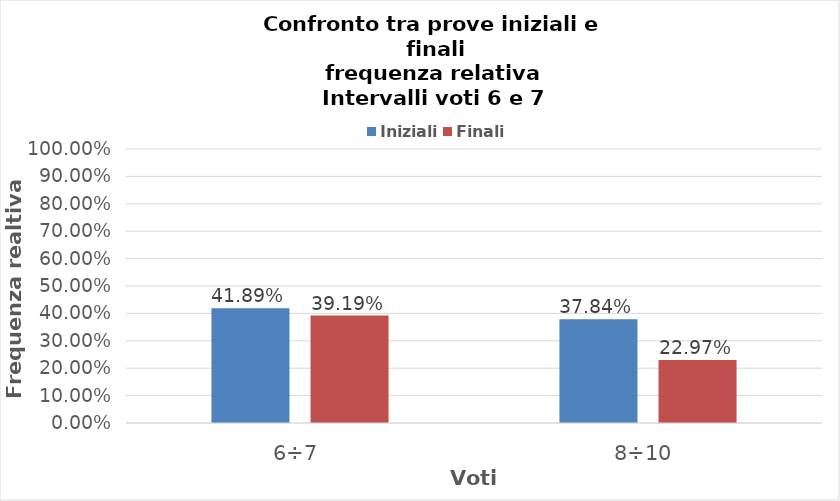
| Category | Iniziali | Finali |
|---|---|---|
| 6÷7 | 0.419 | 0.392 |
| 8÷10 | 0.378 | 0.23 |